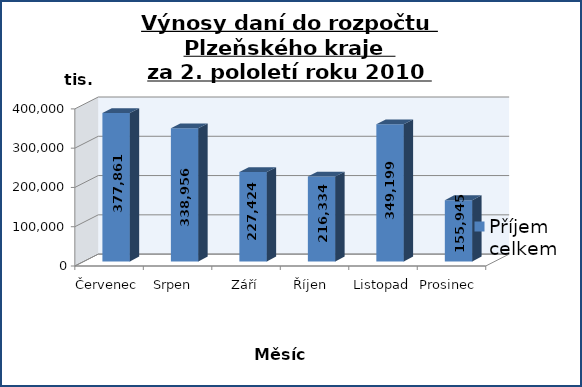
| Category | Příjem celkem |
|---|---|
| Červenec  | 377860.661 |
| Srpen  | 338956.044 |
| Září | 227423.972 |
| Říjen  | 216334.359 |
| Listopad | 349199.025 |
| Prosinec  | 155945.214 |